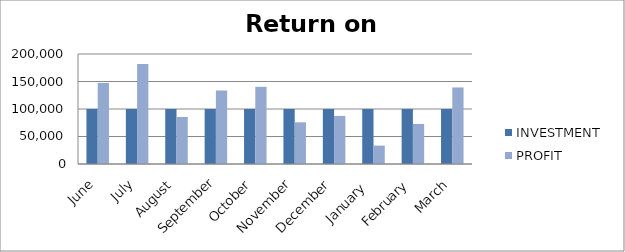
| Category | INVESTMENT  | PROFIT |
|---|---|---|
| June | 100000 | 147454 |
| July | 100000 | 181784 |
| August | 100000 | 85543 |
| September | 100000 | 133590 |
| October | 100000 | 140368 |
| November | 100000 | 75780 |
| December | 100000 | 87377 |
| January  | 100000 | 33435 |
| February | 100000 | 72800 |
| March | 100000 | 139150 |